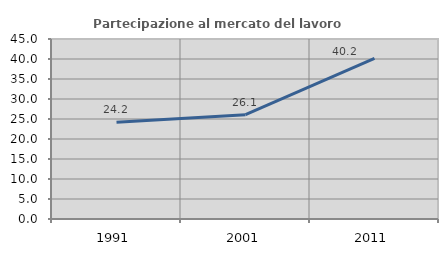
| Category | Partecipazione al mercato del lavoro  femminile |
|---|---|
| 1991.0 | 24.176 |
| 2001.0 | 26.087 |
| 2011.0 | 40.187 |